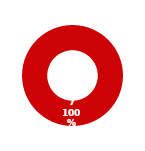
| Category | RM |
|---|---|
| MIL 2 Complete | 0 |
| MIL 2 Not Complete | 7 |